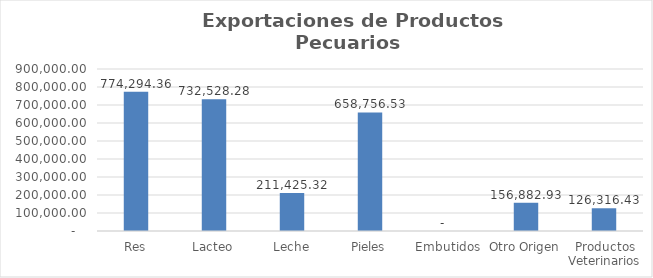
| Category | Valor US$ |
|---|---|
| Res | 774294.36 |
| Lacteo | 732528.28 |
| Leche | 211425.32 |
| Pieles | 658756.53 |
| Embutidos | 0 |
| Otro Origen | 156882.93 |
| Productos Veterinarios | 126316.43 |